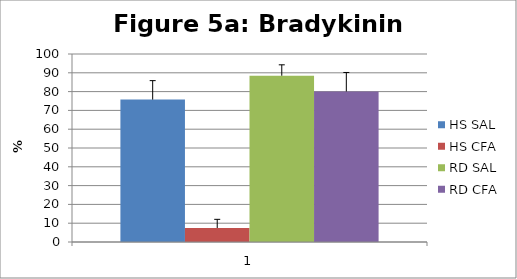
| Category | HS SAL | HS CFA | RD SAL | RD CFA |
|---|---|---|---|---|
| 0 | 75.733 | 7.455 | 88.448 | 80.07 |